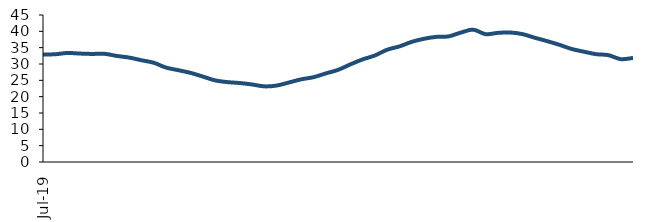
| Category | Series 0 |
|---|---|
| 2019-07-01 | 32.907 |
| 2019-08-01 | 32.987 |
| 2019-09-01 | 33.382 |
| 2019-10-01 | 33.194 |
| 2019-11-01 | 33.082 |
| 2019-12-01 | 33.123 |
| 2020-01-01 | 32.469 |
| 2020-02-01 | 31.976 |
| 2020-03-01 | 31.156 |
| 2020-04-01 | 30.392 |
| 2020-05-01 | 28.913 |
| 2020-06-01 | 28.108 |
| 2020-07-01 | 27.29 |
| 2020-08-01 | 26.155 |
| 2020-09-01 | 24.984 |
| 2020-10-01 | 24.457 |
| 2020-11-01 | 24.181 |
| 2020-12-01 | 23.74 |
| 2021-01-01 | 23.158 |
| 2021-02-01 | 23.396 |
| 2021-03-01 | 24.331 |
| 2021-04-01 | 25.306 |
| 2021-05-01 | 25.953 |
| 2021-06-01 | 27.111 |
| 2021-07-01 | 28.2 |
| 2021-08-01 | 29.868 |
| 2021-09-01 | 31.404 |
| 2021-10-01 | 32.611 |
| 2021-11-01 | 34.373 |
| 2021-12-01 | 35.387 |
| 2022-01-01 | 36.784 |
| 2022-02-01 | 37.727 |
| 2022-03-01 | 38.303 |
| 2022-04-01 | 38.455 |
| 2022-05-01 | 39.626 |
| 2022-06-01 | 40.515 |
| 2022-07-01 | 39.14 |
| 2022-08-01 | 39.529 |
| 2022-09-01 | 39.638 |
| 2022-10-01 | 39.158 |
| 2022-11-01 | 38.048 |
| 2022-12-01 | 37.019 |
| 2023-01-01 | 35.89 |
| 2023-02-01 | 34.611 |
| 2023-03-01 | 33.773 |
| 2023-04-01 | 33.011 |
| 2023-05-01 | 32.711 |
| 2023-06-01 | 31.485 |
| 2023-07-01 | 31.855 |